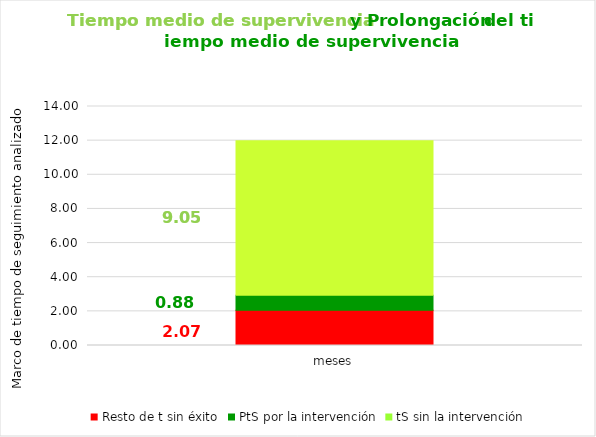
| Category | Resto de t sin éxito | PtS por la intervención | tS sin la intervención |
|---|---|---|---|
| meses | 2.068 | 0.88 | 9.052 |